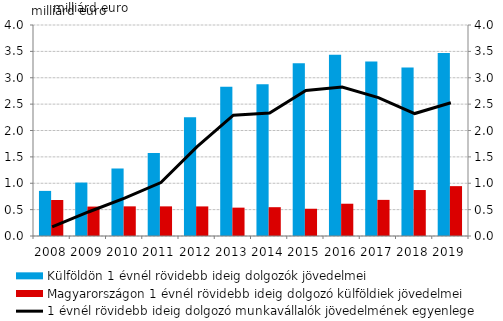
| Category | Külföldön 1 évnél rövidebb ideig dolgozók jövedelmei | Magyarországon 1 évnél rövidebb ideig dolgozó külföldiek jövedelmei |
|---|---|---|
| 2008.0 | 0.855 | 0.682 |
| 2009.0 | 1.013 | 0.558 |
| 2010.0 | 1.28 | 0.562 |
| 2011.0 | 1.576 | 0.562 |
| 2012.0 | 2.254 | 0.561 |
| 2013.0 | 2.828 | 0.538 |
| 2014.0 | 2.878 | 0.546 |
| 2015.0 | 3.275 | 0.517 |
| 2016.0 | 3.435 | 0.612 |
| 2017.0 | 3.309 | 0.685 |
| 2018.0 | 3.193 | 0.871 |
| 2019.0 | 3.471 | 0.945 |